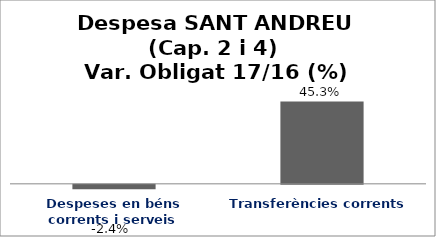
| Category | Series 0 |
|---|---|
| Despeses en béns corrents i serveis | -0.024 |
| Transferències corrents | 0.453 |